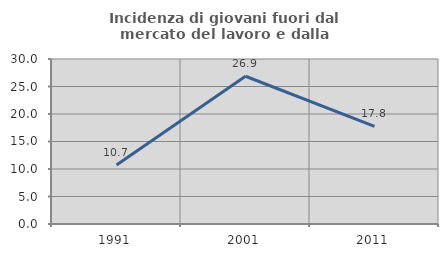
| Category | Incidenza di giovani fuori dal mercato del lavoro e dalla formazione  |
|---|---|
| 1991.0 | 10.745 |
| 2001.0 | 26.86 |
| 2011.0 | 17.766 |